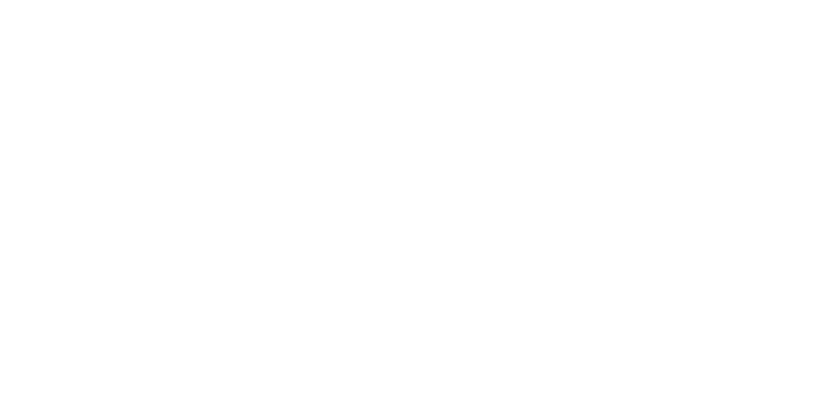
| Category | Total |
|---|---|
| Al Hodeidah | 77975 |
| Hajjah | 72702 |
| Marib | 51281 |
| Al Jawf | 14809 |
| Taiz | 14470 |
| Hadramawt | 8306 |
| Sadah | 7417 |
| Aden | 5195 |
| Lahj | 4950 |
| Abyan | 4181 |
| Amran | 4179 |
| Sanaa | 3912 |
| Ad Dali | 3871 |
| Ibb | 2964 |
| Dhamar | 2232 |
| Al Bayda | 1752 |
| Shabwah | 1118 |
| Al Mahwit | 1049 |
| Al Maharah | 457 |
| Raymah | 451 |
| Sanaa City | 167 |
| Socotra | 15 |